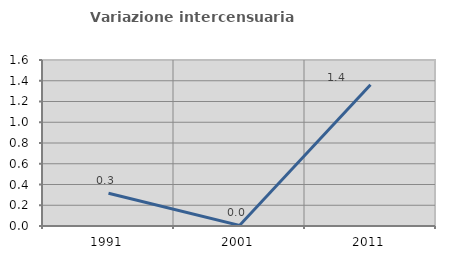
| Category | Variazione intercensuaria annua |
|---|---|
| 1991.0 | 0.315 |
| 2001.0 | 0.006 |
| 2011.0 | 1.361 |